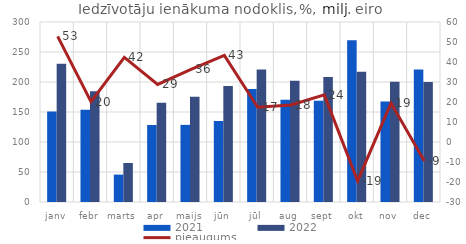
| Category | 2021 | 2022 |
|---|---|---|
| janv | 150.693 | 230.249 |
| febr | 153.563 | 184.559 |
| marts | 45.661 | 65.002 |
| apr | 128.345 | 165.307 |
| maijs | 128.556 | 175.243 |
| jūn | 134.986 | 193.472 |
| jūl | 188.253 | 220.964 |
| aug | 170.505 | 202.017 |
| sept | 168.642 | 208.39 |
| okt | 269.575 | 217.091 |
| nov | 167.634 | 200.285 |
| dec | 220.865 | 199.898 |